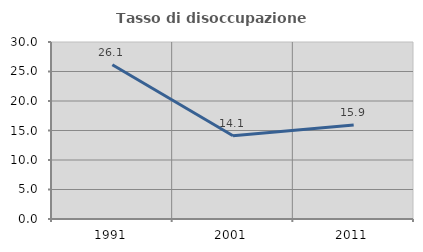
| Category | Tasso di disoccupazione giovanile  |
|---|---|
| 1991.0 | 26.131 |
| 2001.0 | 14.118 |
| 2011.0 | 15.942 |